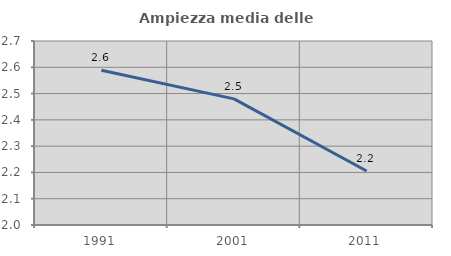
| Category | Ampiezza media delle famiglie |
|---|---|
| 1991.0 | 2.589 |
| 2001.0 | 2.48 |
| 2011.0 | 2.205 |